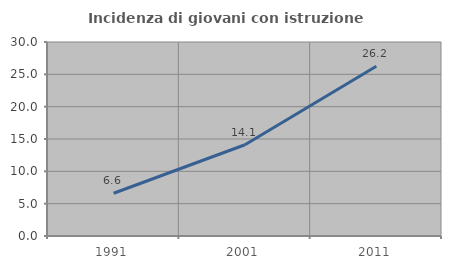
| Category | Incidenza di giovani con istruzione universitaria |
|---|---|
| 1991.0 | 6.614 |
| 2001.0 | 14.115 |
| 2011.0 | 26.237 |